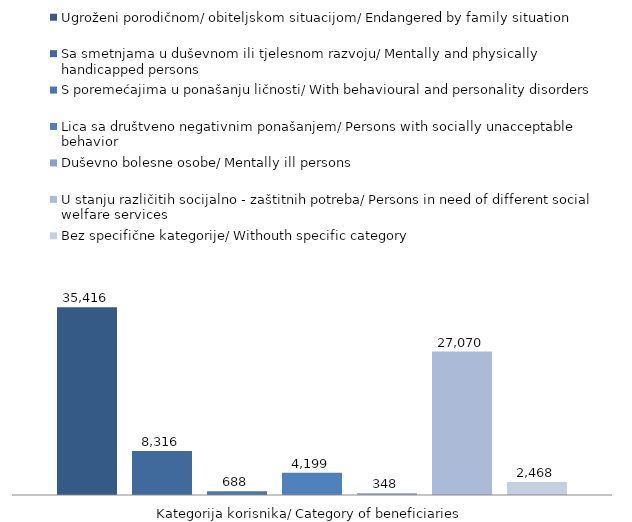
| Category | Ugroženi porodičnom/ obiteljskom situacijom/ Endangered by family situation | Sa smetnjama u duševnom ili tjelesnom razvoju/ Mentally and physically handicapped persons | S poremećajima u ponašanju ličnosti/ With behavioural and personality disorders | Lica sa društveno negativnim ponašanjem/ Persons with socially unacceptable behavior | Duševno bolesne osobe/ Mentally ill persons | U stanju različitih socijalno - zaštitnih potreba/ Persons in need of different social welfare services | Bez specifične kategorije/ Withouth specific category |
|---|---|---|---|---|---|---|---|
| 0 | 35416 | 8316 | 688 | 4199 | 348 | 27070 | 2468 |